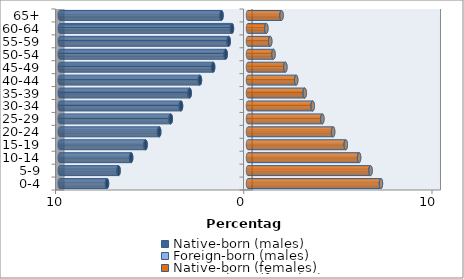
| Category | Native-born (males) | Foreign-born (males) | Native-born (females) | Foreign-born (females) |
|---|---|---|---|---|
| 0-4 | -7.489 | -0.005 | 7.061 | 0.002 |
| 5-9 | -6.875 | -0.009 | 6.506 | 0.005 |
| 10-14 | -6.207 | -0.015 | 5.897 | 0.007 |
| 15-19 | -5.439 | -0.018 | 5.187 | 0.009 |
| 20-24 | -4.715 | -0.022 | 4.517 | 0.009 |
| 25-29 | -4.101 | -0.024 | 3.943 | 0.009 |
| 30-34 | -3.557 | -0.024 | 3.432 | 0.008 |
| 35-39 | -3.096 | -0.021 | 3.008 | 0.007 |
| 40-44 | -2.552 | -0.016 | 2.555 | 0.006 |
| 45-49 | -1.852 | -0.012 | 1.98 | 0.005 |
| 50-54 | -1.184 | -0.009 | 1.351 | 0.004 |
| 55-59 | -1.025 | -0.007 | 1.177 | 0.004 |
| 60-64 | -0.853 | -0.006 | 0.97 | 0.003 |
| 65+ | -1.406 | -0.009 | 1.777 | 0.006 |